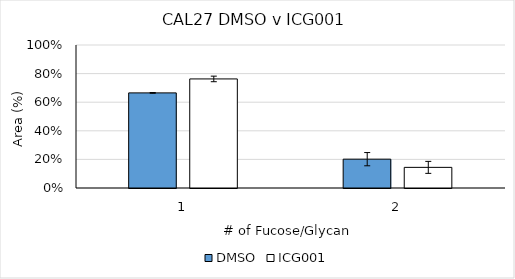
| Category | DMSO | ICG001 |
|---|---|---|
| 0 | 0.665 | 0.763 |
| 1 | 0.202 | 0.144 |